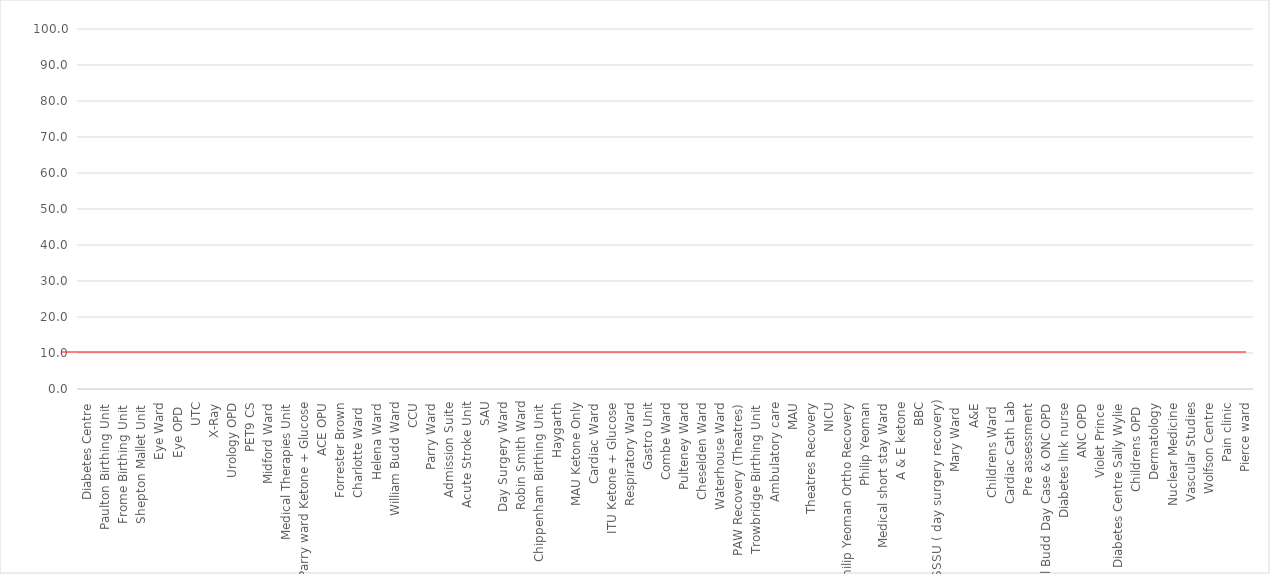
| Category | Series 1 |
|---|---|
| Diabetes Centre | 0 |
| Paulton Birthing Unit  | 0 |
| Frome Birthing Unit  | 0 |
| Shepton Mallet Unit  | 0 |
| Eye Ward | 0 |
| Eye OPD  | 0 |
| UTC | 0 |
| X-Ray | 0 |
| Urology OPD | 0 |
| PET9 CS | 0 |
| Midford Ward | 0 |
| Medical Therapies Unit | 0 |
| Parry ward Ketone + Glucose | 0 |
| ACE OPU | 0 |
| Forrester Brown | 0 |
| Charlotte Ward  | 0 |
| Helena Ward | 0 |
| William Budd Ward | 0 |
| CCU | 0 |
| Parry Ward | 0 |
| Admission Suite | 0 |
| Acute Stroke Unit | 0 |
| SAU | 0 |
| Day Surgery Ward | 0 |
| Robin Smith Ward | 0 |
| Chippenham Birthing Unit  | 0 |
| Haygarth | 0 |
| MAU Ketone Only | 0 |
| Cardiac Ward | 0 |
| ITU Ketone + Glucose | 0 |
| Respiratory Ward | 0 |
| Gastro Unit | 0 |
| Combe Ward | 0 |
| Pulteney Ward | 0 |
| Cheselden Ward | 0 |
| Waterhouse Ward | 0 |
| PAW Recovery (Theatres) | 0 |
| Trowbridge Birthing Unit  | 0 |
| Ambulatory care | 0 |
| MAU | 0 |
| Theatres Recovery | 0 |
| NICU | 0 |
| Philip Yeoman Ortho Recovery | 0 |
| Philip Yeoman | 0 |
| Medical short stay Ward | 0 |
| A & E ketone | 0 |
| BBC | 0 |
| SSSU ( day surgery recovery) | 0 |
| Mary Ward  | 0 |
| A&E | 0 |
| Childrens Ward  | 0 |
| Cardiac Cath Lab | 0 |
| Pre assessment | 0 |
| Will Budd Day Case & ONC OPD | 0 |
| Diabetes link nurse | 0 |
| ANC OPD | 0 |
| Violet Prince | 0 |
| Diabetes Centre Sally Wylie | 0 |
| Childrens OPD  | 0 |
| Dermatology | 0 |
| Nuclear Medicine | 0 |
| Vascular Studies | 0 |
| Wolfson Centre | 0 |
| Pain clinic | 0 |
| Pierce ward | 0 |